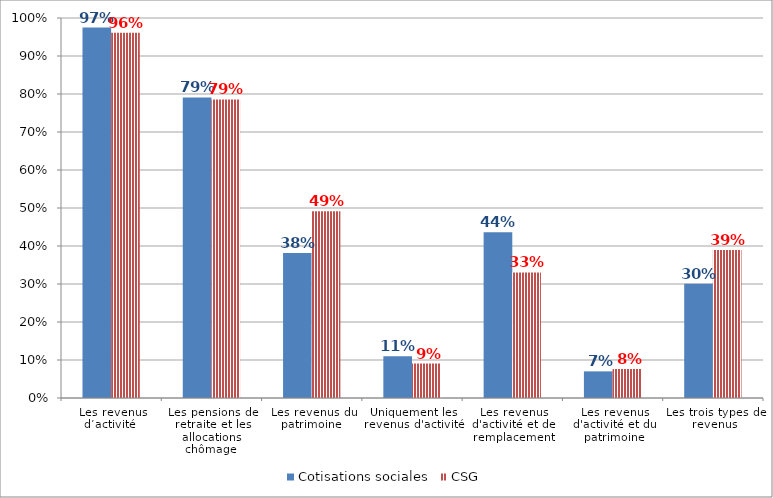
| Category | Cotisations sociales | CSG |
|---|---|---|
| Les revenus d’activité  | 0.975 | 0.961 |
| Les pensions de retraite et les allocations chômage  | 0.791 | 0.786 |
| Les revenus du patrimoine  | 0.382 | 0.492 |
| Uniquement les revenus d'activité | 0.11 | 0.091 |
| Les revenus d'activité et de remplacement | 0.436 | 0.33 |
| Les revenus d'activité et du patrimoine | 0.07 | 0.076 |
| Les trois types de revenus | 0.301 | 0.39 |